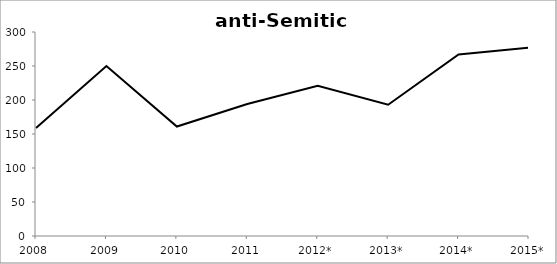
| Category | #REF! |
|---|---|
| 2008 | 159 |
| 2009 | 250 |
| 2010 | 161 |
| 2011 | 194 |
| 2012* | 221 |
| 2013* | 193 |
| 2014* | 267 |
| 2015* | 277 |